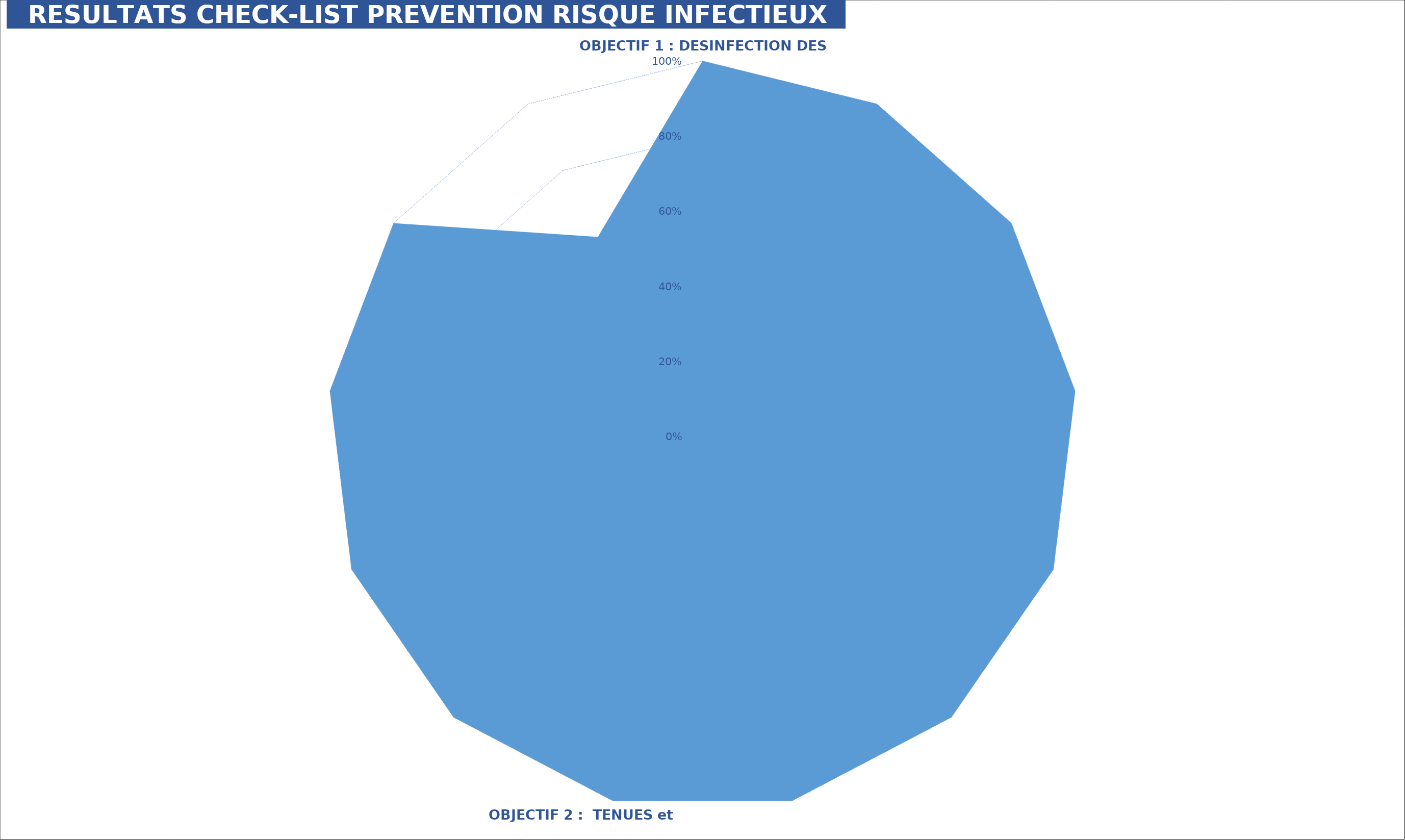
| Category | Series 0 |
|---|---|
| OBJECTIF 1 : DESINFECTION DES MAINS | 1 |
| OBJECTIF 2 :  TENUES et EPI | 1 |
| OBJECTIF 3 : DISPOSITIFS INVASIFS | 1 |
| OBJECTIF 4 : NUTRiTION PARENTERALE ET AUTRES INJECTABLES | 1 |
| OBJECTIF 5 : NUTRITION ENTERALE - GESTION DU LAIT - BIBERONNERIE | 1 |
| OBJECTIF 6 : PRECAUTIONS COMPLEMENTAIRES | 1 |
| OBJECTIF 7 : GESTION DES EXCRETA  | 1 |
| OBJECTIF 8 : BIONETTOYAGE (BN) DU MATERIEL ET DE L'ENVIRONNEMENT | 1 |
| OBJECTIF 9 : BIONETTOYAGE DES INCUBATEURS | 1 |
| OBJECTIF 10  : ORGANISATION DES SOINS | 1 |
| OBJECTIF 11  : GESTION RH | 1 |
| OBJECTIF 12  : PARENTS | 1 |
| OBJECTIF 13  : AUTRE | 0.6 |